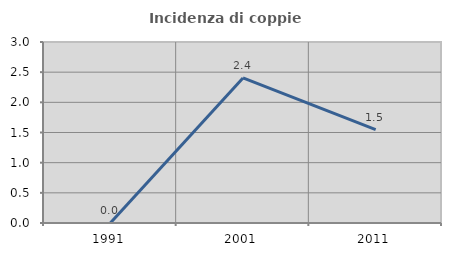
| Category | Incidenza di coppie miste |
|---|---|
| 1991.0 | 0 |
| 2001.0 | 2.404 |
| 2011.0 | 1.549 |